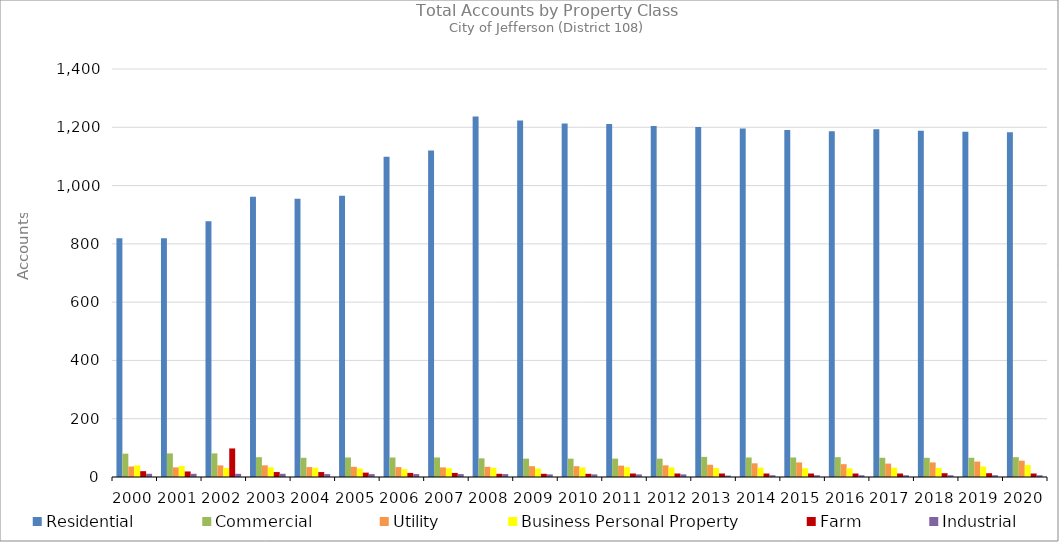
| Category | Residential | Commercial | Utility | Business Personal Property | Farm | Industrial |
|---|---|---|---|---|---|---|
| 2000.0 | 819 | 80 | 36 | 40 | 20 | 11 |
| 2001.0 | 819 | 81 | 33 | 38 | 19 | 11 |
| 2002.0 | 878 | 81 | 40 | 31 | 98 | 11 |
| 2003.0 | 962 | 68 | 40 | 33 | 17 | 11 |
| 2004.0 | 955 | 66 | 34 | 32 | 17 | 10 |
| 2005.0 | 965 | 67 | 35 | 29 | 15 | 10 |
| 2006.0 | 1099 | 67 | 34 | 27 | 14 | 10 |
| 2007.0 | 1120 | 67 | 33 | 30 | 14 | 10 |
| 2008.0 | 1237 | 64 | 35 | 32 | 11 | 10 |
| 2009.0 | 1223 | 63 | 37 | 29 | 11 | 9 |
| 2010.0 | 1213 | 63 | 37 | 33 | 11 | 9 |
| 2011.0 | 1211 | 63 | 39 | 34 | 12 | 9 |
| 2012.0 | 1204 | 63 | 40 | 33 | 12 | 9 |
| 2013.0 | 1201 | 69 | 42 | 31 | 12 | 5 |
| 2014.0 | 1196 | 67 | 47 | 32 | 12 | 6 |
| 2015.0 | 1191 | 67 | 50 | 30 | 12 | 6 |
| 2016.0 | 1186 | 68 | 44 | 30 | 12 | 6 |
| 2017.0 | 1193 | 66 | 46 | 32 | 12 | 6 |
| 2018.0 | 1188 | 66 | 50 | 31 | 13 | 6 |
| 2019.0 | 1185 | 66 | 53 | 36 | 13 | 6 |
| 2020.0 | 1183 | 68 | 56 | 41 | 12 | 6 |